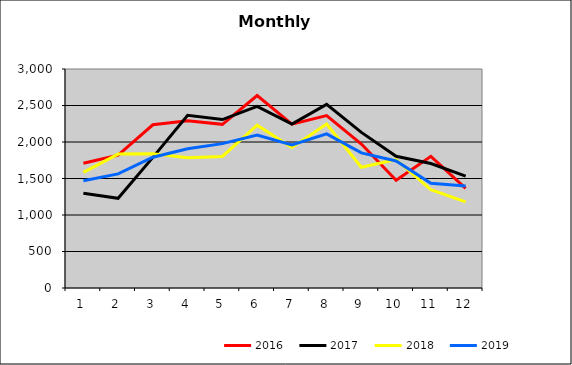
| Category | 2016 | 2017 | 2018 | 2019 |
|---|---|---|---|---|
| 0 | 1709.692 | 1297.347 | 1584.945 | 1467.961 |
| 1 | 1818.591 | 1228.546 | 1834.566 | 1563.301 |
| 2 | 2235.971 | 1789.782 | 1838.878 | 1791.351 |
| 3 | 2290.052 | 2364.914 | 1785.082 | 1908.351 |
| 4 | 2241.602 | 2307.576 | 1801.761 | 1977.85 |
| 5 | 2636.687 | 2488.575 | 2229.629 | 2096.552 |
| 6 | 2245.31 | 2244.746 | 1923.685 | 1959.132 |
| 7 | 2362.2 | 2515.952 | 2246.519 | 2111.404 |
| 8 | 1971.49 | 2131.972 | 1654.017 | 1851.294 |
| 9 | 1477.1 | 1804.009 | 1760.102 | 1740.445 |
| 10 | 1802.993 | 1705.861 | 1345.712 | 1434.409 |
| 11 | 1366.089 | 1533.212 | 1179.594 | 1396.753 |